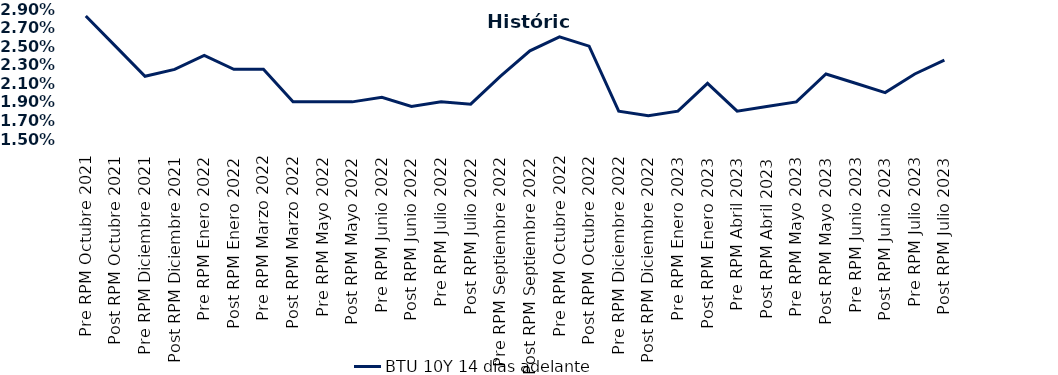
| Category | BTU 10Y 14 días adelante |
|---|---|
| Pre RPM Octubre 2021 | 0.028 |
| Post RPM Octubre 2021 | 0.025 |
| Pre RPM Diciembre 2021 | 0.022 |
| Post RPM Diciembre 2021 | 0.022 |
| Pre RPM Enero 2022 | 0.024 |
| Post RPM Enero 2022 | 0.022 |
| Pre RPM Marzo 2022 | 0.022 |
| Post RPM Marzo 2022 | 0.019 |
| Pre RPM Mayo 2022 | 0.019 |
| Post RPM Mayo 2022 | 0.019 |
| Pre RPM Junio 2022 | 0.02 |
| Post RPM Junio 2022 | 0.018 |
| Pre RPM Julio 2022 | 0.019 |
| Post RPM Julio 2022 | 0.019 |
| Pre RPM Septiembre 2022 | 0.022 |
| Post RPM Septiembre 2022 | 0.024 |
| Pre RPM Octubre 2022 | 0.026 |
| Post RPM Octubre 2022 | 0.025 |
| Pre RPM Diciembre 2022 | 0.018 |
| Post RPM Diciembre 2022 | 0.018 |
| Pre RPM Enero 2023 | 0.018 |
| Post RPM Enero 2023 | 0.021 |
| Pre RPM Abril 2023 | 0.018 |
| Post RPM Abril 2023 | 0.018 |
| Pre RPM Mayo 2023 | 0.019 |
| Post RPM Mayo 2023 | 0.022 |
| Pre RPM Junio 2023 | 0.021 |
| Post RPM Junio 2023 | 0.02 |
| Pre RPM Julio 2023 | 0.022 |
| Post RPM Julio 2023 | 0.024 |